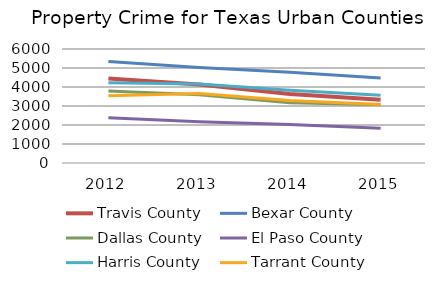
| Category | Travis County | Bexar County | Dallas County | El Paso County | Harris County | Tarrant County |
|---|---|---|---|---|---|---|
| 2012.0 | 4445 | 5345 | 3790 | 2377 | 4227 | 3546 |
| 2013.0 | 4128 | 5028 | 3595 | 2174 | 4158 | 3656 |
| 2014.0 | 3631 | 4770 | 3169 | 2029 | 3825 | 3289 |
| 2015.0 | 3329 | 4472 | 3060 | 1824 | 3560 | 3079 |